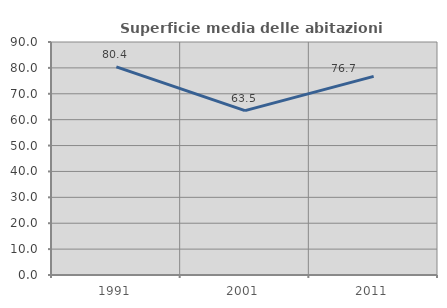
| Category | Superficie media delle abitazioni occupate |
|---|---|
| 1991.0 | 80.375 |
| 2001.0 | 63.488 |
| 2011.0 | 76.737 |